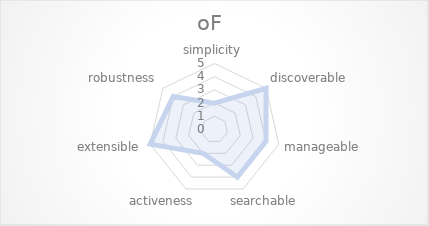
| Category | oF |
|---|---|
| simplicity | 2 |
| discoverable | 5 |
| manageable | 4 |
| searchable | 4 |
| activeness | 2 |
| extensible | 5 |
| robustness | 4 |